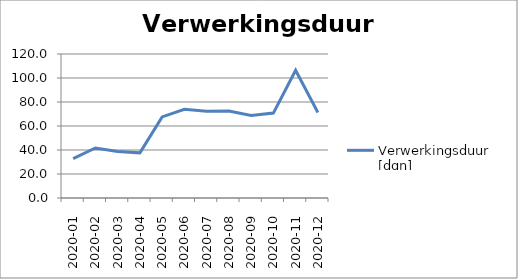
| Category | Verwerkingsduur [dgn] |
|---|---|
| 2020-01 | 32.833 |
| 2020-02 | 41.654 |
| 2020-03 | 38.718 |
| 2020-04 | 37.62 |
| 2020-05 | 67.604 |
| 2020-06 | 73.877 |
| 2020-07 | 72.222 |
| 2020-08 | 72.468 |
| 2020-09 | 68.747 |
| 2020-10 | 70.743 |
| 2020-11 | 106.381 |
| 2020-12 | 71.284 |